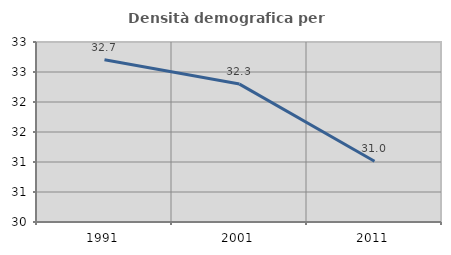
| Category | Densità demografica |
|---|---|
| 1991.0 | 32.703 |
| 2001.0 | 32.298 |
| 2011.0 | 31.012 |